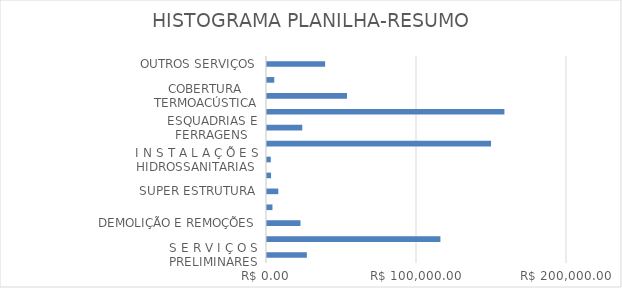
| Category | Series 0 |
|---|---|
| S E R V I Ç O S PRELIMINARES | 26567.73 |
| ADMINISTRAÇÃO | 115610.42 |
| DEMOLIÇÃO E REMOÇÕES | 22320.23 |
| FUNDAÇÕES | 3638.36 |
| SUPER ESTRUTURA | 7535.06 |
| I N S T A L A Ç Õ E S ELETRICAS | 2713.78 |
| I N S T A L A Ç Õ E S HIDROSSANITARIAS | 2514.49 |
| PAREDES PAINÉIS E REVESTIMENTOS | 149368.65 |
| ESQUADRIAS E FERRAGENS | 23521.49 |
| PINTURA | 158271.7 |
| COBERTURA TERMOACÚSTICA | 53339.67 |
| AGUAS PLUVIAIS | 4858.22 |
| OUTROS SERVIÇOS | 38740.2 |